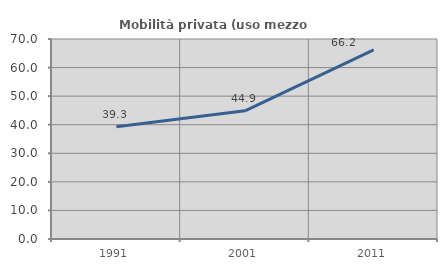
| Category | Mobilità privata (uso mezzo privato) |
|---|---|
| 1991.0 | 39.295 |
| 2001.0 | 44.872 |
| 2011.0 | 66.193 |